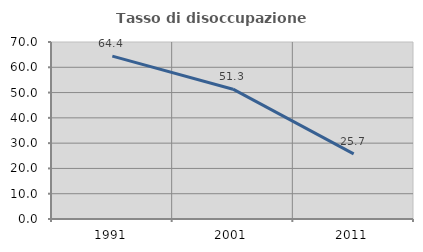
| Category | Tasso di disoccupazione giovanile  |
|---|---|
| 1991.0 | 64.407 |
| 2001.0 | 51.337 |
| 2011.0 | 25.735 |